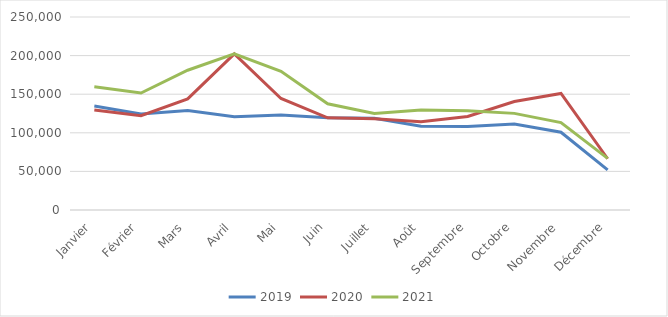
| Category | 2019 | 2020 | 2021 |
|---|---|---|---|
| Janvier | 134619 | 129520 | 159588 |
| Février | 124456 | 122110 | 151570 |
| Mars | 128898 | 143858 | 181021 |
| Avril | 120881 | 202240 | 202207 |
| Mai | 122921 | 144476 | 179591 |
| Juin | 119374 | 119412 | 137653 |
| Juillet | 118847 | 118246 | 125161 |
| Août | 108491 | 114428 | 129673 |
| Septembre | 108009 | 121176 | 128571 |
| Octobre | 111453 | 140570 | 125164 |
| Novembre | 100694 | 150905 | 113163 |
| Décembre | 52026 | 66385 | 66924 |